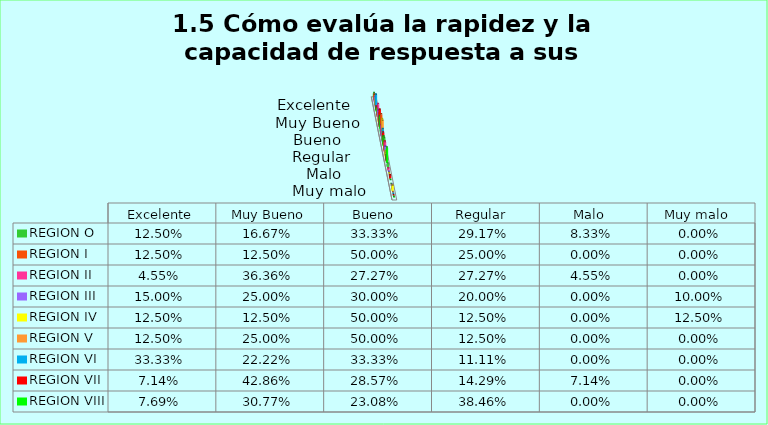
| Category | REGION O | REGION I  | REGION II | REGION III | REGION IV | REGION V  | REGION VI  | REGION VII  | REGION VIII |
|---|---|---|---|---|---|---|---|---|---|
| Excelente | 0.125 | 0.125 | 0.045 | 0.15 | 0.125 | 0.125 | 0.333 | 0.071 | 0.077 |
| Muy Bueno | 0.167 | 0.125 | 0.364 | 0.25 | 0.125 | 0.25 | 0.222 | 0.429 | 0.308 |
| Bueno  | 0.333 | 0.5 | 0.273 | 0.3 | 0.5 | 0.5 | 0.333 | 0.286 | 0.231 |
| Regular  | 0.292 | 0.25 | 0.273 | 0.2 | 0.125 | 0.125 | 0.111 | 0.143 | 0.385 |
| Malo  | 0.083 | 0 | 0.045 | 0 | 0 | 0 | 0 | 0.071 | 0 |
| Muy malo  | 0 | 0 | 0 | 0.1 | 0.125 | 0 | 0 | 0 | 0 |